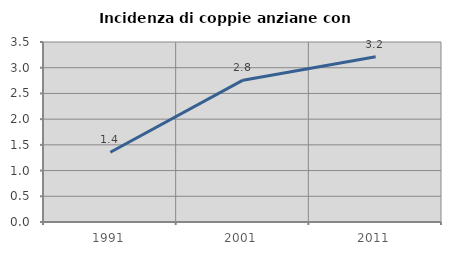
| Category | Incidenza di coppie anziane con figli |
|---|---|
| 1991.0 | 1.357 |
| 2001.0 | 2.758 |
| 2011.0 | 3.212 |